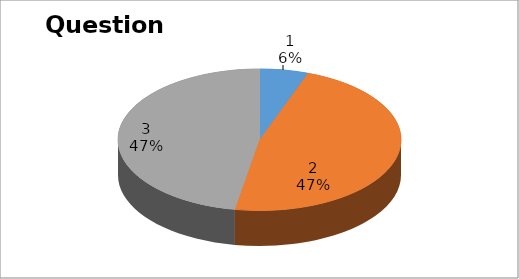
| Category | Series 0 |
|---|---|
| 0 | 2 |
| 1 | 17 |
| 2 | 17 |